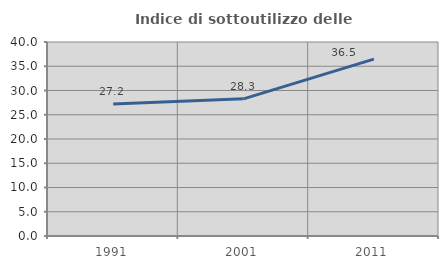
| Category | Indice di sottoutilizzo delle abitazioni  |
|---|---|
| 1991.0 | 27.21 |
| 2001.0 | 28.284 |
| 2011.0 | 36.479 |